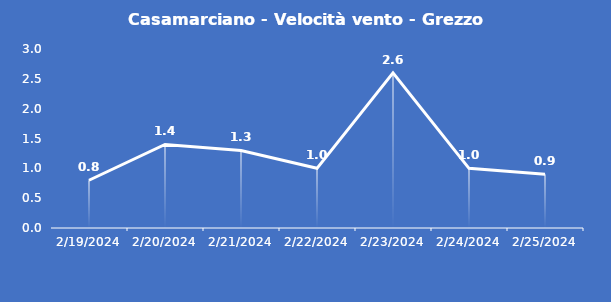
| Category | Casamarciano - Velocità vento - Grezzo (m/s) |
|---|---|
| 2/19/24 | 0.8 |
| 2/20/24 | 1.4 |
| 2/21/24 | 1.3 |
| 2/22/24 | 1 |
| 2/23/24 | 2.6 |
| 2/24/24 | 1 |
| 2/25/24 | 0.9 |